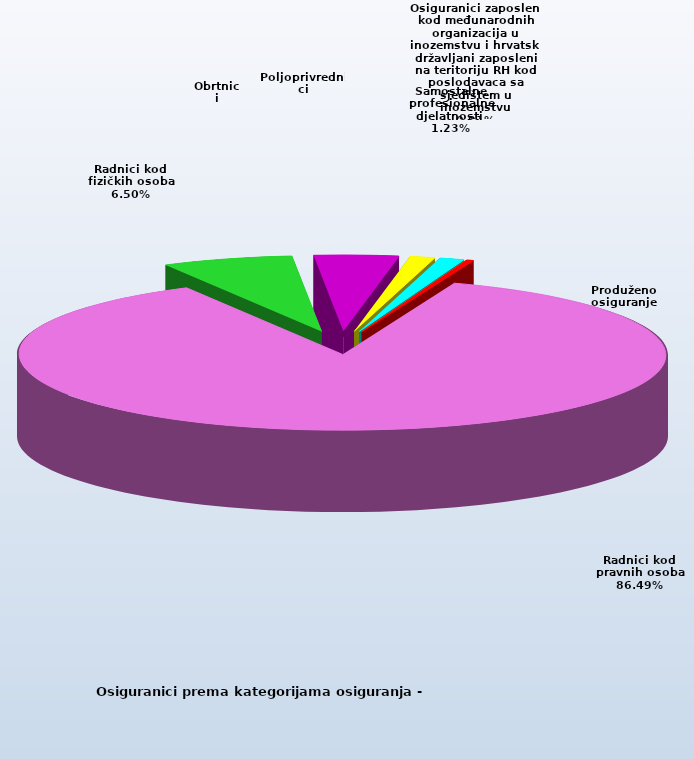
| Category | Series 0 |
|---|---|
| Radnici kod pravnih osoba | 1330739 |
| Radnici kod fizičkih osoba | 100024 |
| Obrtnici | 64604 |
| Poljoprivrednici | 19176 |
| Samostalne profesionalne djelatnosti  | 18877 |
| Osiguranici zaposleni kod međunarodnih organizacija u inozemstvu i hrvatski državljani zaposleni na teritoriju RH kod poslodavaca sa sjedištem u inozemstvu | 83 |
| Produženo osiguranje | 5118 |